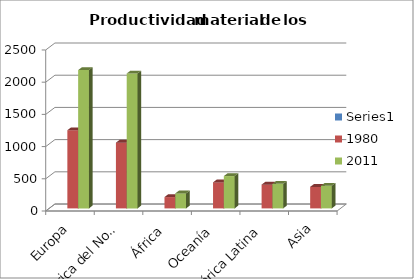
| Category | Series 0 | 1980 | 2011 |
|---|---|---|---|
| Europa |  | 1214 | 2147 |
| América del Norte |  | 1021 | 2095 |
| África |  | 176 | 233 |
| Oceanía |  | 404 | 502 |
| América Latina |  | 369 | 381 |
| Asia |  | 334 | 352 |